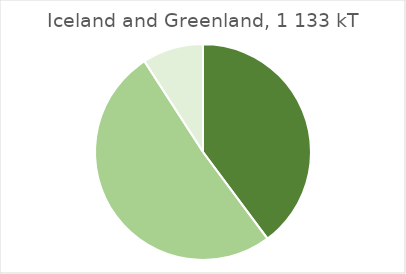
| Category | Iceland and Greenland |
|---|---|
| Landings of assessed stocks for which adequate information is available to determine GES for F and/or SSB | 451088.457 |
| Landings of assessed stocks for which insufficient information is available to determine GES for F and/or SSB | 578266.571 |
| Landings unassessed stocks | 103397.036 |